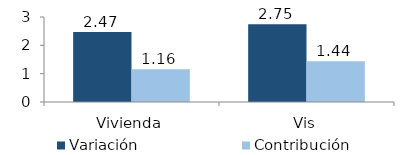
| Category | Variación | Contribución |
|---|---|---|
| Vivienda | 2.469 | 1.159 |
| Vis | 2.746 | 1.435 |